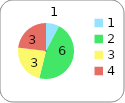
| Category | Series 0 |
|---|---|
| 0 | 1 |
| 1 | 6 |
| 2 | 3 |
| 3 | 3 |